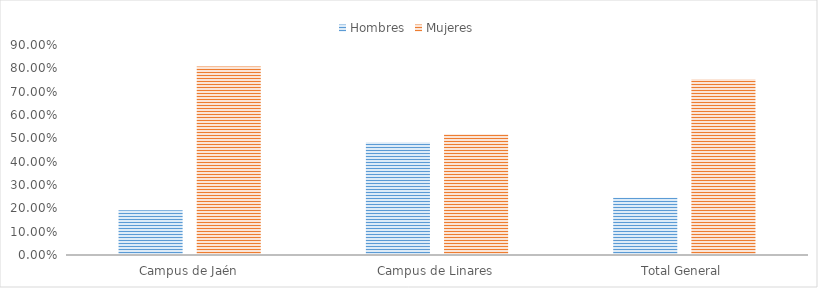
| Category | Hombres | Mujeres |
|---|---|---|
| Campus de Jaén | 0.192 | 0.808 |
| Campus de Linares | 0.483 | 0.517 |
| Total General | 0.245 | 0.755 |